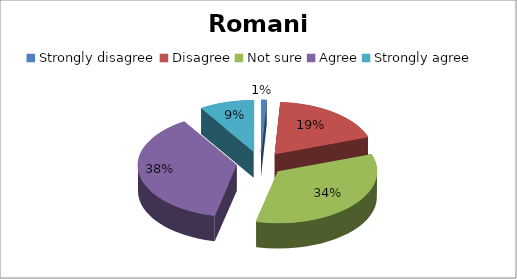
| Category | Series 0 |
|---|---|
| Strongly disagree | 1 |
| Disagree | 21 |
| Not sure | 38 |
| Agree | 42 |
| Strongly agree | 10 |